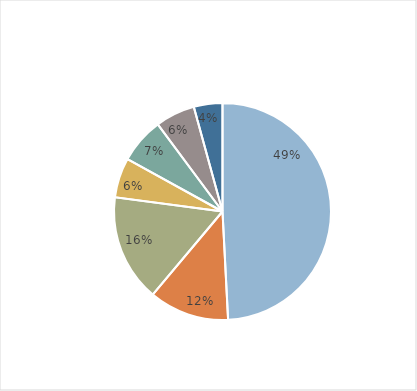
| Category | Series 0 | Data C |
|---|---|---|
| 0 | 89.531 | 0 |
| 1 | 21.732 | 0 |
| 2 | 29.093 | 0 |
| 3 | 10.78 | 0 |
| 4 | 12.414 | 0 |
| 5 | 10.749 | 0 |
| 6 | 7.758 | 0 |